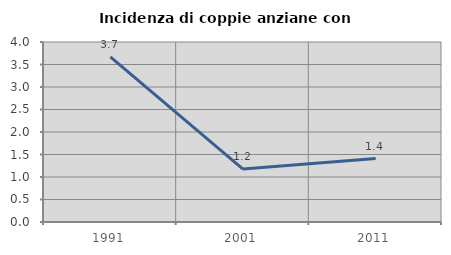
| Category | Incidenza di coppie anziane con figli |
|---|---|
| 1991.0 | 3.67 |
| 2001.0 | 1.176 |
| 2011.0 | 1.408 |